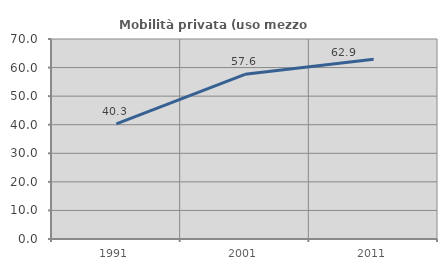
| Category | Mobilità privata (uso mezzo privato) |
|---|---|
| 1991.0 | 40.282 |
| 2001.0 | 57.638 |
| 2011.0 | 62.909 |